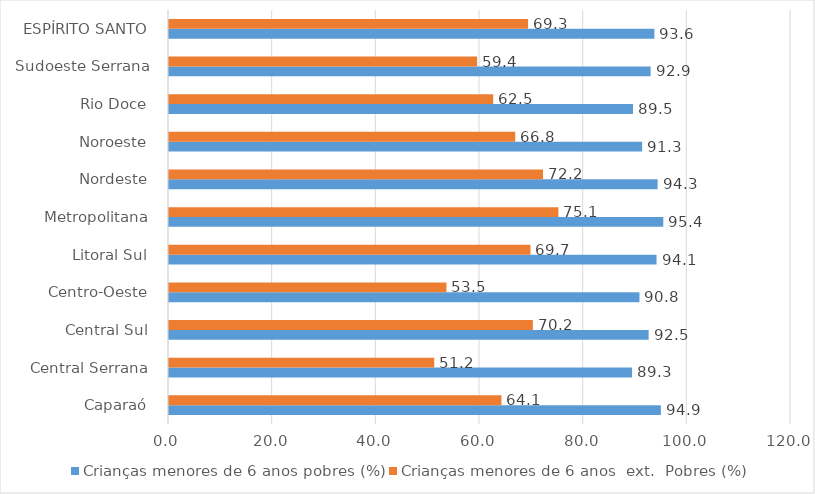
| Category | Crianças menores de 6 anos pobres (%) | Crianças menores de 6 anos  ext.  Pobres (%) |
|---|---|---|
|  Caparaó  | 94.897 | 64.134 |
|  Central Serrana  | 89.329 | 51.17 |
|  Central Sul  | 92.534 | 70.196 |
|  Centro-Oeste  | 90.765 | 53.533 |
|  Litoral Sul  | 94.059 | 69.742 |
|  Metropolitana  | 95.367 | 75.124 |
|  Nordeste  | 94.27 | 72.16 |
|  Noroeste  | 91.28 | 66.802 |
|  Rio Doce  | 89.514 | 62.54 |
|  Sudoeste Serrana  | 92.918 | 59.447 |
|  ESPÍRITO SANTO  | 93.639 | 69.278 |